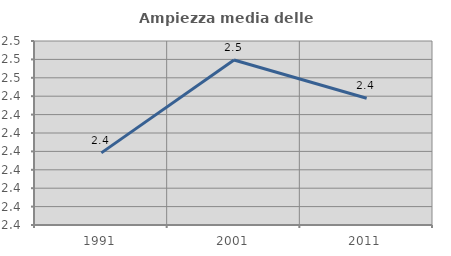
| Category | Ampiezza media delle famiglie |
|---|---|
| 1991.0 | 2.43 |
| 2001.0 | 2.455 |
| 2011.0 | 2.444 |